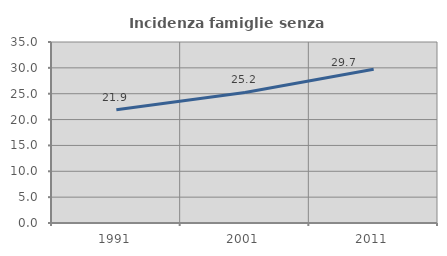
| Category | Incidenza famiglie senza nuclei |
|---|---|
| 1991.0 | 21.921 |
| 2001.0 | 25.237 |
| 2011.0 | 29.716 |